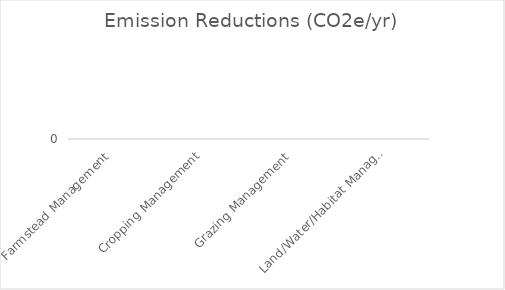
| Category | CO2e/yr |
|---|---|
| Farmstead Management | 0 |
| Cropping Management | 0 |
| Grazing Management | 0 |
| Land/Water/Habitat Management | 0 |